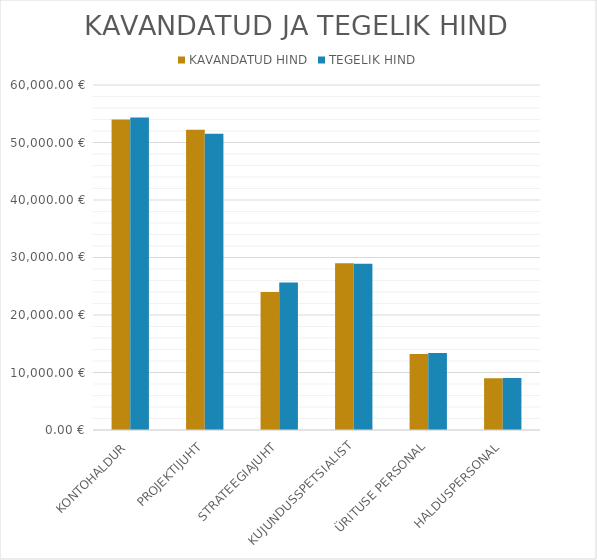
| Category | KAVANDATUD HIND | TEGELIK HIND |
|---|---|---|
| KONTOHALDUR | 54000 | 54360 |
| PROJEKTIJUHT | 52200 | 51540 |
| STRATEEGIAJUHT | 24000 | 25650 |
| KUJUNDUSSPETSIALIST | 29000 | 28900 |
| ÜRITUSE PERSONAL | 13200 | 13400 |
| HALDUSPERSONAL | 9000 | 9060 |